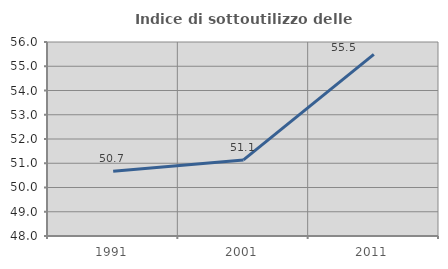
| Category | Indice di sottoutilizzo delle abitazioni  |
|---|---|
| 1991.0 | 50.667 |
| 2001.0 | 51.136 |
| 2011.0 | 55.49 |